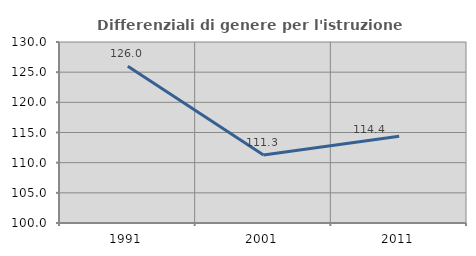
| Category | Differenziali di genere per l'istruzione superiore |
|---|---|
| 1991.0 | 125.989 |
| 2001.0 | 111.282 |
| 2011.0 | 114.372 |